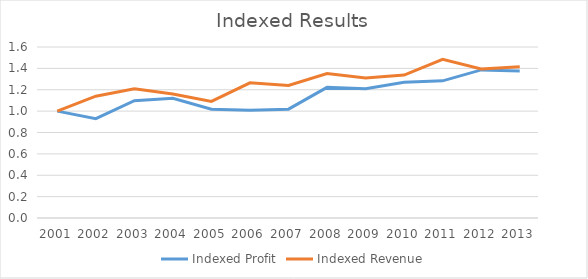
| Category | Indexed Profit | Indexed Revenue |
|---|---|---|
| 2001.0 | 1 | 1 |
| 2002.0 | 0.93 | 1.14 |
| 2003.0 | 1.097 | 1.208 |
| 2004.0 | 1.119 | 1.16 |
| 2005.0 | 1.019 | 1.09 |
| 2006.0 | 1.008 | 1.265 |
| 2007.0 | 1.019 | 1.24 |
| 2008.0 | 1.222 | 1.351 |
| 2009.0 | 1.21 | 1.311 |
| 2010.0 | 1.27 | 1.337 |
| 2011.0 | 1.283 | 1.484 |
| 2012.0 | 1.386 | 1.395 |
| 2013.0 | 1.375 | 1.415 |